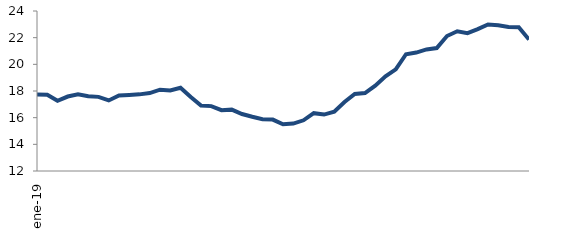
| Category | Series 0 |
|---|---|
| 2019-01-01 | 17.746 |
| 2019-02-01 | 17.724 |
| 2019-03-01 | 17.269 |
| 2019-04-01 | 17.585 |
| 2019-05-01 | 17.752 |
| 2019-06-01 | 17.602 |
| 2019-07-01 | 17.56 |
| 2019-08-01 | 17.291 |
| 2019-09-01 | 17.666 |
| 2019-10-01 | 17.704 |
| 2019-11-01 | 17.747 |
| 2019-12-01 | 17.844 |
| 2020-01-01 | 18.099 |
| 2020-02-01 | 18.039 |
| 2020-03-01 | 18.244 |
| 2020-04-01 | 17.551 |
| 2020-05-01 | 16.911 |
| 2020-06-01 | 16.867 |
| 2020-07-01 | 16.563 |
| 2020-08-01 | 16.602 |
| 2020-09-01 | 16.272 |
| 2020-10-01 | 16.069 |
| 2020-11-01 | 15.889 |
| 2020-12-01 | 15.855 |
| 2021-01-01 | 15.501 |
| 2021-02-01 | 15.555 |
| 2021-03-01 | 15.803 |
| 2021-04-01 | 16.335 |
| 2021-05-01 | 16.232 |
| 2021-06-01 | 16.452 |
| 2021-07-01 | 17.177 |
| 2021-08-01 | 17.778 |
| 2021-09-01 | 17.842 |
| 2021-10-01 | 18.396 |
| 2021-11-01 | 19.101 |
| 2021-12-01 | 19.622 |
| 2022-01-01 | 20.759 |
| 2022-02-01 | 20.883 |
| 2022-03-01 | 21.119 |
| 2022-04-01 | 21.22 |
| 2022-05-01 | 22.124 |
| 2022-06-01 | 22.477 |
| 2022-07-01 | 22.34 |
| 2022-08-01 | 22.636 |
| 2022-09-01 | 22.99 |
| 2022-10-01 | 22.932 |
| 2022-11-01 | 22.799 |
| 2022-12-01 | 22.789 |
| 2023-01-01 | 21.858 |